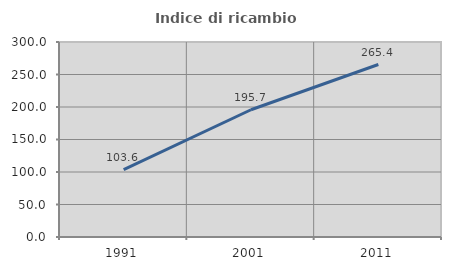
| Category | Indice di ricambio occupazionale  |
|---|---|
| 1991.0 | 103.614 |
| 2001.0 | 195.745 |
| 2011.0 | 265.385 |